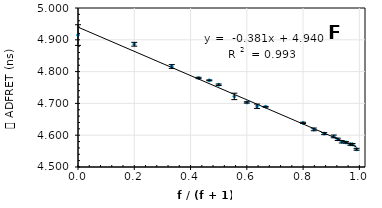
| Category | tADFRET |
|---|---|
| 0.0 | 4.915 |
| 0.2 | 4.886 |
| 0.3333333333333333 | 4.816 |
| 0.42857142857142855 | 4.78 |
| 0.4666666666666667 | 4.772 |
| 0.5 | 4.759 |
| 0.5555555555555556 | 4.722 |
| 0.6 | 4.703 |
| 0.6363636363636364 | 4.691 |
| 0.6666666666666666 | 4.69 |
| 0.8 | 4.639 |
| 0.8381877022653722 | 4.618 |
| 0.875 | 4.605 |
| 0.9090909090909091 | 4.596 |
| 0.9230769230769231 | 4.587 |
| 0.9375 | 4.579 |
| 0.9523809523809523 | 4.577 |
| 0.967741935483871 | 4.572 |
| 0.975609756097561 | 4.571 |
| 0.9900990099009901 | 4.556 |